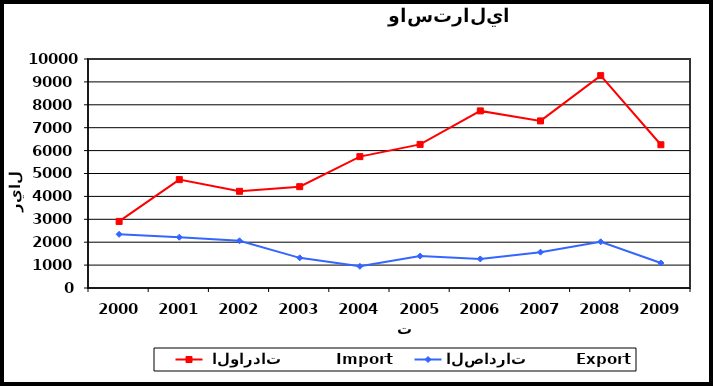
| Category |  الواردات           Import | الصادرات          Export |
|---|---|---|
| 2000.0 | 2907 | 2344 |
| 2001.0 | 4733 | 2218 |
| 2002.0 | 4223 | 2062 |
| 2003.0 | 4425 | 1317 |
| 2004.0 | 5737 | 946 |
| 2005.0 | 6270 | 1394 |
| 2006.0 | 7734 | 1269 |
| 2007.0 | 7296 | 1565 |
| 2008.0 | 9274 | 2018 |
| 2009.0 | 6256 | 1091 |